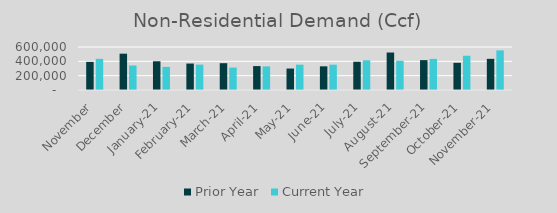
| Category | Prior Year | Current Year |
|---|---|---|
| November | 392357 | 434815 |
| December | 507022 | 342584.594 |
| January-21 | 400923.849 | 322657.16 |
| February-21 | 369131.684 | 354041 |
| March-21 | 374117 | 313343 |
| April-21 | 333800.488 | 329084.722 |
| May-21 | 299245.56 | 353085 |
| June-21 | 330441.187 | 353141.442 |
| July-21 | 394304.316 | 414577.112 |
| August-21 | 522963.473 | 407774.995 |
| September-21 | 416886.629 | 434192.442 |
| October-21 | 379515 | 477878.526 |
| November-21 | 434815 | 552599.698 |